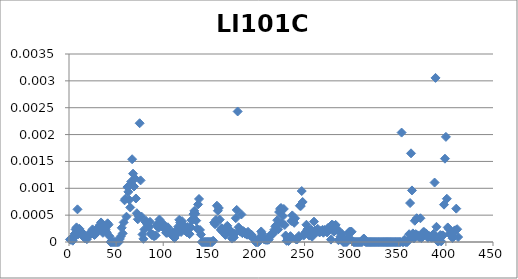
| Category |  LI101C |
|---|---|
| 0 | 0 |
| 1 | 0 |
| 2 | 0 |
| 3 | 0 |
| 4 | 0 |
| 5 | 0 |
| 6 | 0 |
| 7 | 0 |
| 8 | 0.001 |
| 9 | 0 |
| 10 | 0 |
| 11 | 0 |
| 12 | 0 |
| 13 | 0 |
| 14 | 0 |
| 15 | 0 |
| 16 | 0 |
| 17 | 0 |
| 18 | 0 |
| 19 | 0 |
| 20 | 0 |
| 21 | 0 |
| 22 | 0 |
| 23 | 0 |
| 24 | 0 |
| 25 | 0 |
| 26 | 0 |
| 27 | 0 |
| 28 | 0 |
| 29 | 0 |
| 30 | 0 |
| 31 | 0 |
| 32 | 0 |
| 33 | 0 |
| 34 | 0 |
| 35 | 0 |
| 36 | 0 |
| 37 | 0 |
| 38 | 0 |
| 39 | 0 |
| 40 | 0 |
| 41 | 0 |
| 42 | 0 |
| 43 | 0 |
| 44 | 0 |
| 45 | 0 |
| 46 | 0 |
| 47 | 0 |
| 48 | 0 |
| 49 | 0 |
| 50 | 0 |
| 51 | 0 |
| 52 | 0 |
| 53 | 0 |
| 54 | 0 |
| 55 | 0 |
| 56 | 0 |
| 57 | 0 |
| 58 | 0.001 |
| 59 | 0.001 |
| 60 | 0 |
| 61 | 0.001 |
| 62 | 0.001 |
| 63 | 0.001 |
| 64 | 0.001 |
| 65 | 0.001 |
| 66 | 0.002 |
| 67 | 0.001 |
| 68 | 0.001 |
| 69 | 0.001 |
| 70 | 0.001 |
| 71 | 0.001 |
| 72 | 0 |
| 73 | 0 |
| 74 | 0.002 |
| 75 | 0.001 |
| 76 | 0 |
| 77 | 0 |
| 78 | 0 |
| 79 | 0 |
| 80 | 0 |
| 81 | 0 |
| 82 | 0 |
| 83 | 0 |
| 84 | 0 |
| 85 | 0 |
| 86 | 0 |
| 87 | 0 |
| 88 | 0 |
| 89 | 0 |
| 90 | 0 |
| 91 | 0 |
| 92 | 0 |
| 93 | 0 |
| 94 | 0 |
| 95 | 0 |
| 96 | 0 |
| 97 | 0 |
| 98 | 0 |
| 99 | 0 |
| 100 | 0 |
| 101 | 0 |
| 102 | 0 |
| 103 | 0 |
| 104 | 0 |
| 105 | 0 |
| 106 | 0 |
| 107 | 0 |
| 108 | 0 |
| 109 | 0 |
| 110 | 0 |
| 111 | 0 |
| 112 | 0 |
| 113 | 0 |
| 114 | 0 |
| 115 | 0 |
| 116 | 0 |
| 117 | 0 |
| 118 | 0 |
| 119 | 0 |
| 120 | 0 |
| 121 | 0 |
| 122 | 0 |
| 123 | 0 |
| 124 | 0 |
| 125 | 0 |
| 126 | 0 |
| 127 | 0 |
| 128 | 0 |
| 129 | 0 |
| 130 | 0 |
| 131 | 0.001 |
| 132 | 0.001 |
| 133 | 0.001 |
| 134 | 0 |
| 135 | 0 |
| 136 | 0.001 |
| 137 | 0.001 |
| 138 | 0 |
| 139 | 0 |
| 140 | 0 |
| 141 | 0 |
| 142 | 0 |
| 143 | 0 |
| 144 | 0 |
| 145 | 0 |
| 146 | 0 |
| 147 | 0 |
| 148 | 0 |
| 149 | 0 |
| 150 | 0 |
| 151 | 0 |
| 152 | 0 |
| 153 | 0 |
| 154 | 0 |
| 155 | 0 |
| 156 | 0.001 |
| 157 | 0.001 |
| 158 | 0.001 |
| 159 | 0 |
| 160 | 0 |
| 161 | 0 |
| 162 | 0 |
| 163 | 0 |
| 164 | 0 |
| 165 | 0 |
| 166 | 0 |
| 167 | 0 |
| 168 | 0 |
| 169 | 0 |
| 170 | 0 |
| 171 | 0 |
| 172 | 0 |
| 173 | 0 |
| 174 | 0 |
| 175 | 0 |
| 176 | 0 |
| 177 | 0.001 |
| 178 | 0.002 |
| 179 | 0 |
| 180 | 0 |
| 181 | 0 |
| 182 | 0.001 |
| 183 | 0 |
| 184 | 0 |
| 185 | 0 |
| 186 | 0 |
| 187 | 0 |
| 188 | 0 |
| 189 | 0 |
| 190 | 0 |
| 191 | 0 |
| 192 | 0 |
| 193 | 0 |
| 194 | 0 |
| 195 | 0 |
| 196 | 0 |
| 197 | 0 |
| 198 | 0 |
| 199 | 0 |
| 200 | 0 |
| 201 | 0 |
| 202 | 0 |
| 203 | 0 |
| 204 | 0 |
| 205 | 0 |
| 206 | 0 |
| 207 | 0 |
| 208 | 0 |
| 209 | 0 |
| 210 | 0 |
| 211 | 0 |
| 212 | 0 |
| 213 | 0 |
| 214 | 0 |
| 215 | 0 |
| 216 | 0 |
| 217 | 0 |
| 218 | 0 |
| 219 | 0 |
| 220 | 0 |
| 221 | 0 |
| 222 | 0.001 |
| 223 | 0.001 |
| 224 | 0.001 |
| 225 | 0 |
| 226 | 0 |
| 227 | 0.001 |
| 228 | 0 |
| 229 | 0 |
| 230 | 0 |
| 231 | 0 |
| 232 | 0 |
| 233 | 0 |
| 234 | 0 |
| 235 | 0 |
| 236 | 0 |
| 237 | 0 |
| 238 | 0 |
| 239 | 0 |
| 240 | 0 |
| 241 | 0 |
| 242 | 0 |
| 243 | 0 |
| 244 | 0.001 |
| 245 | 0.001 |
| 246 | 0.001 |
| 247 | 0.001 |
| 248 | 0 |
| 249 | 0 |
| 250 | 0 |
| 251 | 0 |
| 252 | 0 |
| 253 | 0 |
| 254 | 0 |
| 255 | 0 |
| 256 | 0 |
| 257 | 0 |
| 258 | 0 |
| 259 | 0 |
| 260 | 0 |
| 261 | 0 |
| 262 | 0 |
| 263 | 0 |
| 264 | 0 |
| 265 | 0 |
| 266 | 0 |
| 267 | 0 |
| 268 | 0 |
| 269 | 0 |
| 270 | 0 |
| 271 | 0 |
| 272 | 0 |
| 273 | 0 |
| 274 | 0 |
| 275 | 0 |
| 276 | 0 |
| 277 | 0 |
| 278 | 0 |
| 279 | 0 |
| 280 | 0 |
| 281 | 0 |
| 282 | 0 |
| 283 | 0 |
| 284 | 0 |
| 285 | 0 |
| 286 | 0 |
| 287 | 0 |
| 288 | 0 |
| 289 | 0 |
| 290 | 0 |
| 291 | 0 |
| 292 | 0 |
| 293 | 0 |
| 294 | 0 |
| 295 | 0 |
| 296 | 0 |
| 297 | 0 |
| 298 | 0 |
| 299 | 0 |
| 300 | 0 |
| 301 | 0 |
| 302 | 0 |
| 303 | 0 |
| 304 | 0 |
| 305 | 0 |
| 306 | 0 |
| 307 | 0 |
| 308 | 0 |
| 309 | 0 |
| 310 | 0 |
| 311 | 0 |
| 312 | 0 |
| 313 | 0 |
| 314 | 0 |
| 315 | 0 |
| 316 | 0 |
| 317 | 0 |
| 318 | 0 |
| 319 | 0 |
| 320 | 0 |
| 321 | 0 |
| 322 | 0 |
| 323 | 0 |
| 324 | 0 |
| 325 | 0 |
| 326 | 0 |
| 327 | 0 |
| 328 | 0 |
| 329 | 0 |
| 330 | 0 |
| 331 | 0 |
| 332 | 0 |
| 333 | 0 |
| 334 | 0 |
| 335 | 0 |
| 336 | 0 |
| 337 | 0 |
| 338 | 0 |
| 339 | 0 |
| 340 | 0 |
| 341 | 0 |
| 342 | 0 |
| 343 | 0 |
| 344 | 0 |
| 345 | 0 |
| 346 | 0 |
| 347 | 0 |
| 348 | 0 |
| 349 | 0 |
| 350 | 0 |
| 351 | 0 |
| 352 | 0.002 |
| 353 | 0 |
| 354 | 0 |
| 355 | 0 |
| 356 | 0 |
| 357 | 0 |
| 358 | 0 |
| 359 | 0 |
| 360 | 0 |
| 361 | 0.001 |
| 362 | 0.002 |
| 363 | 0.001 |
| 364 | 0 |
| 365 | 0 |
| 366 | 0 |
| 367 | 0 |
| 368 | 0 |
| 369 | 0 |
| 370 | 0 |
| 371 | 0 |
| 372 | 0 |
| 373 | 0 |
| 374 | 0 |
| 375 | 0 |
| 376 | 0 |
| 377 | 0 |
| 378 | 0 |
| 379 | 0 |
| 380 | 0 |
| 381 | 0 |
| 382 | 0 |
| 383 | 0 |
| 384 | 0 |
| 385 | 0 |
| 386 | 0 |
| 387 | 0.001 |
| 388 | 0.003 |
| 389 | 0 |
| 390 | 0 |
| 391 | 0 |
| 392 | 0 |
| 393 | 0 |
| 394 | 0 |
| 395 | 0 |
| 396 | 0 |
| 397 | 0.001 |
| 398 | 0.002 |
| 399 | 0.002 |
| 400 | 0.001 |
| 401 | 0 |
| 402 | 0 |
| 403 | 0 |
| 404 | 0 |
| 405 | 0 |
| 406 | 0 |
| 407 | 0 |
| 408 | 0 |
| 409 | 0 |
| 410 | 0.001 |
| 411 | 0 |
| 412 | 0 |